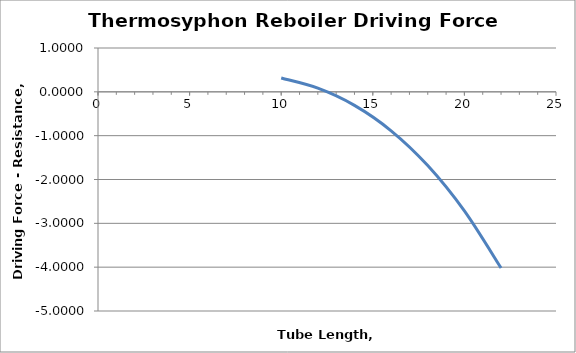
| Category | Series 0 |
|---|---|
| 10.0 | 0.315 |
| 12.0 | 0.083 |
| 14.0 | -0.309 |
| 16.0 | -0.889 |
| 18.0 | -1.683 |
| 20.0 | -2.718 |
| 22.0 | -4.02 |